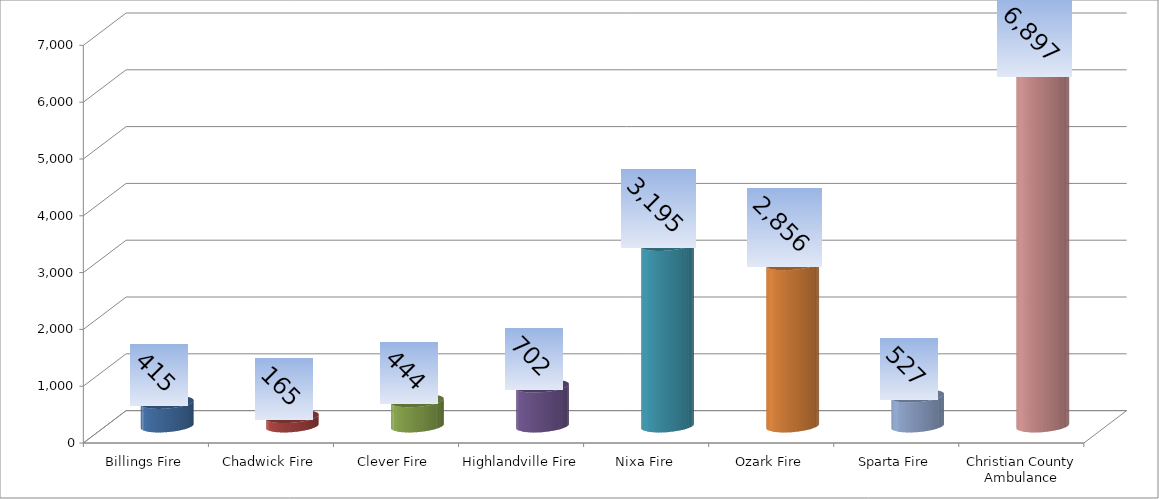
| Category | Series 0 |
|---|---|
| Billings Fire | 415 |
| Chadwick Fire | 165 |
| Clever Fire | 444 |
| Highlandville Fire | 702 |
| Nixa Fire | 3195 |
| Ozark Fire | 2856 |
| Sparta Fire | 527 |
| Christian County Ambulance District | 6897 |